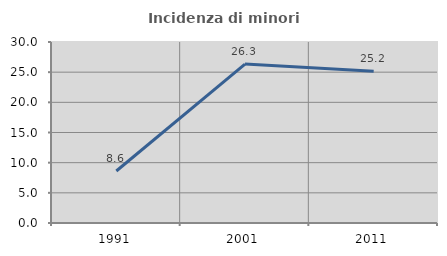
| Category | Incidenza di minori stranieri |
|---|---|
| 1991.0 | 8.621 |
| 2001.0 | 26.34 |
| 2011.0 | 25.158 |